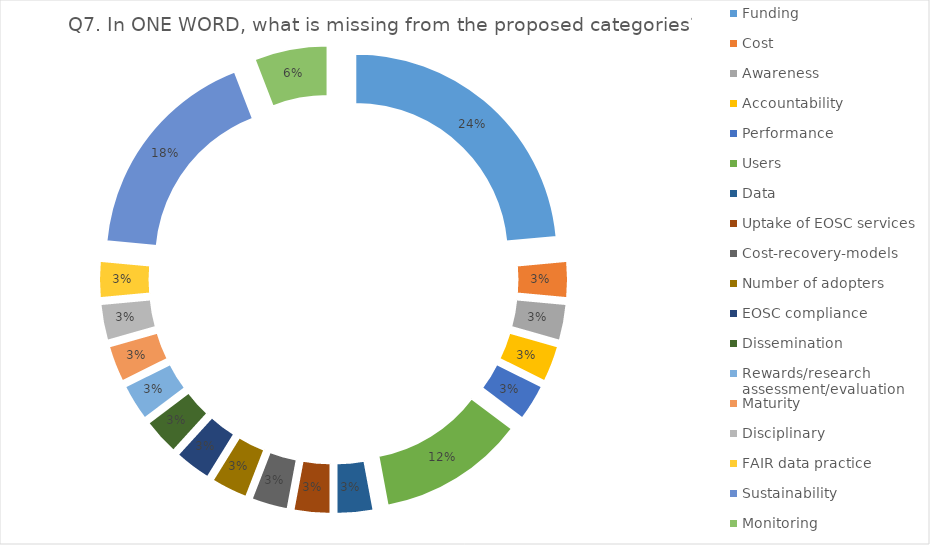
| Category | Series 0 |
|---|---|
| Funding | 8 |
| Cost | 1 |
| Awareness  | 1 |
| Accountability | 1 |
| Performance | 1 |
| Users | 4 |
| Data | 1 |
| Uptake of EOSC services | 1 |
| Cost-recovery-models | 1 |
| Number of adopters | 1 |
| EOSC compliance | 1 |
| Dissemination | 1 |
| Rewards/research assessment/evaluation | 1 |
| Maturity | 1 |
| Disciplinary | 1 |
| FAIR data practice | 1 |
| Sustainability  | 6 |
| Monitoring | 2 |